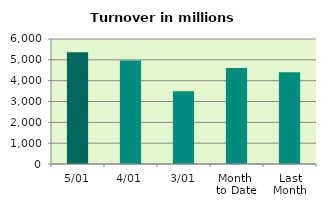
| Category | Series 0 |
|---|---|
| 5/01 | 5361.482 |
| 4/01 | 4971.618 |
| 3/01 | 3492.129 |
| Month 
to Date | 4608.41 |
| Last
Month | 4407.558 |